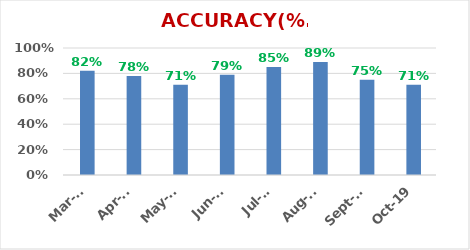
| Category | ACCURACY |
|---|---|
| 2019-10-01 | 0.71 |
| 2019-09-01 | 0.75 |
| 2019-08-01 | 0.89 |
| 2019-07-01 | 0.85 |
| 2019-06-01 | 0.79 |
| 2019-05-01 | 0.71 |
| 2019-04-01 | 0.78 |
| 2019-03-01 | 0.82 |